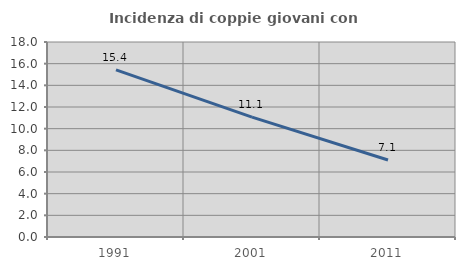
| Category | Incidenza di coppie giovani con figli |
|---|---|
| 1991.0 | 15.431 |
| 2001.0 | 11.059 |
| 2011.0 | 7.111 |